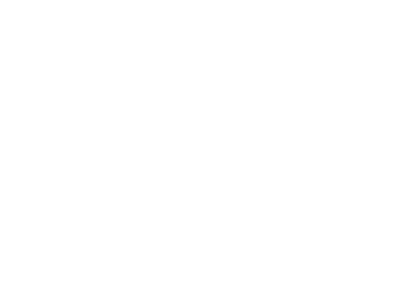
| Category | Total |
|---|---|
| A iniciar | 214 |
| Atrasado | 28 |
| Cancelado | 3 |
| Concluído | 15 |
| Em dia | 203 |
| Suspenso | 4 |
| - | 23 |
| (vazio) | 3 |